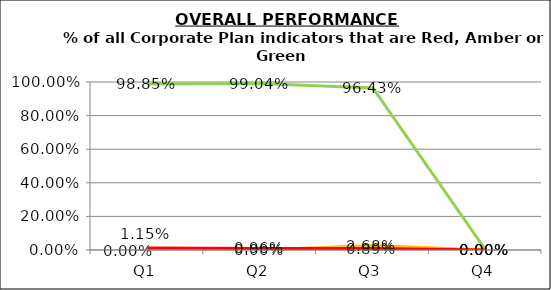
| Category | Green | Amber | Red |
|---|---|---|---|
| Q1 | 0.989 | 0 | 0.011 |
| Q2 | 0.99 | 0 | 0.01 |
| Q3 | 0.964 | 0.027 | 0.009 |
| Q4 | 0 | 0 | 0 |